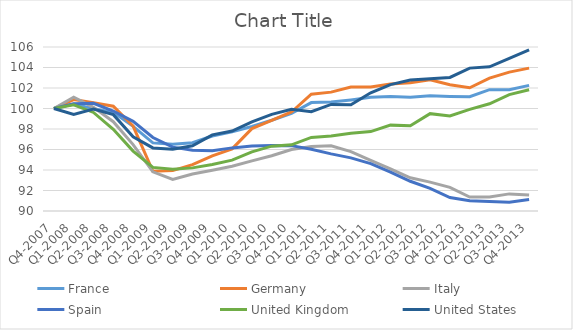
| Category | France | Germany | Italy | Spain | United Kingdom | United States |
|---|---|---|---|---|---|---|
| Q4-2007 | 100 | 100 | 100 | 100 | 100 | 100 |
| Q1-2008 | 100.437 | 100.866 | 101.11 | 100.456 | 100.356 | 99.425 |
| Q2-2008 | 99.979 | 100.57 | 100.115 | 100.512 | 99.613 | 99.939 |
| Q3-2008 | 99.628 | 100.226 | 98.716 | 99.753 | 97.973 | 99.398 |
| Q4-2008 | 98.26 | 98.289 | 96.477 | 98.748 | 95.845 | 97.247 |
| Q1-2009 | 96.643 | 93.87 | 93.821 | 97.169 | 94.252 | 96.155 |
| Q2-2009 | 96.506 | 93.939 | 93.076 | 96.228 | 94.073 | 96.017 |
| Q3-2009 | 96.658 | 94.519 | 93.607 | 95.928 | 94.207 | 96.366 |
| Q4-2009 | 97.313 | 95.375 | 93.975 | 95.868 | 94.533 | 97.425 |
| Q1-2010 | 97.727 | 96.058 | 94.371 | 96.158 | 94.959 | 97.8 |
| Q2-2010 | 98.25 | 98.035 | 94.889 | 96.333 | 95.775 | 98.701 |
| Q3-2010 | 98.85 | 98.842 | 95.39 | 96.379 | 96.329 | 99.429 |
| Q4-2010 | 99.514 | 99.658 | 96.002 | 96.378 | 96.454 | 99.928 |
| Q1-2011 | 100.578 | 101.399 | 96.299 | 96.03 | 97.177 | 99.688 |
| Q2-2011 | 100.625 | 101.596 | 96.361 | 95.57 | 97.321 | 100.401 |
| Q3-2011 | 100.835 | 102.097 | 95.798 | 95.182 | 97.583 | 100.373 |
| Q4-2011 | 101.087 | 102.107 | 94.935 | 94.617 | 97.745 | 101.536 |
| Q1-2012 | 101.163 | 102.383 | 94.101 | 93.796 | 98.378 | 102.331 |
| Q2-2012 | 101.09 | 102.511 | 93.239 | 92.904 | 98.325 | 102.771 |
| Q3-2012 | 101.235 | 102.806 | 92.819 | 92.217 | 99.496 | 102.91 |
| Q4-2012 | 101.179 | 102.314 | 92.301 | 91.316 | 99.268 | 103.027 |
| Q1-2013 | 101.148 | 102.024 | 91.354 | 91.003 | 99.91 | 103.94 |
| Q2-2013 | 101.837 | 102.968 | 91.362 | 90.927 | 100.458 | 104.068 |
| Q3-2013 | 101.827 | 103.548 | 91.669 | 90.865 | 101.358 | 104.883 |
| Q4-2013 | 102.254 | 103.942 | 91.559 | 91.124 | 101.833 | 105.721 |